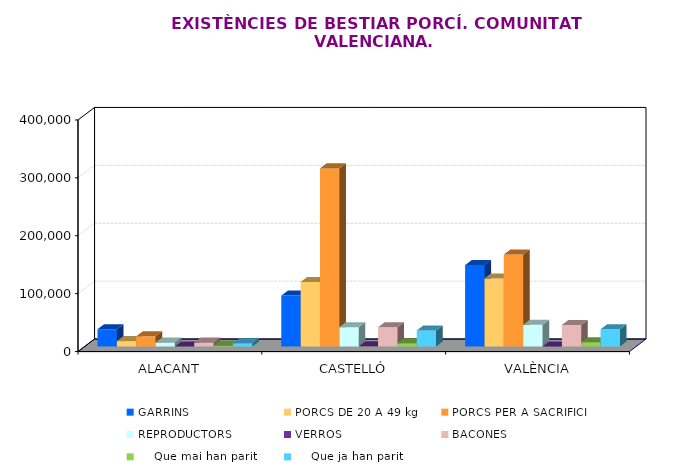
| Category | GARRINS | PORCS DE 20 A 49 kg | PORCS PER A SACRIFICI | REPRODUCTORS | VERROS | BACONES |     Que mai han parit |     Que ja han parit |
|---|---|---|---|---|---|---|---|---|
| ALACANT | 29843 | 9332 | 17573 | 6802 | 41 | 6761 | 1117 | 5644 |
| CASTELLÓ | 87908 | 111509 | 307621 | 33429 | 223 | 33206 | 5497 | 27709 |
| VALÈNCIA | 140576 | 117626 | 158849 | 37418 | 169 | 37249 | 7505 | 29744 |